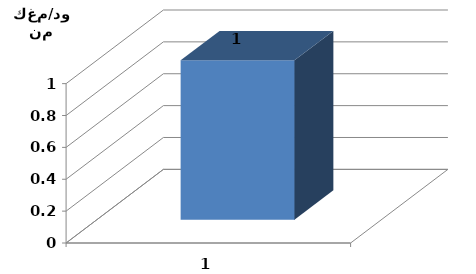
| Category | متوسط الغلة |
|---|---|
| 0 | 1 |